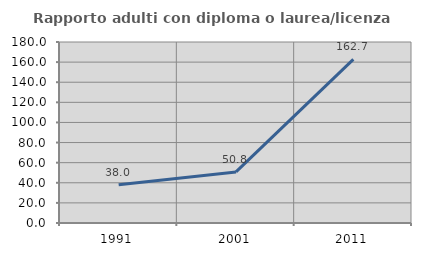
| Category | Rapporto adulti con diploma o laurea/licenza media  |
|---|---|
| 1991.0 | 37.965 |
| 2001.0 | 50.805 |
| 2011.0 | 162.669 |